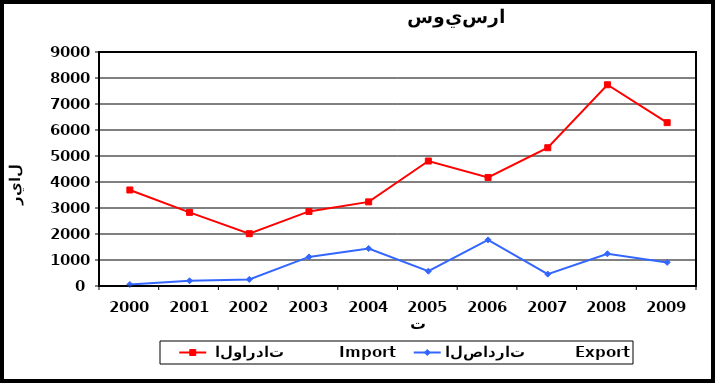
| Category |  الواردات           Import | الصادرات          Export |
|---|---|---|
| 2000.0 | 3693 | 58 |
| 2001.0 | 2832 | 201 |
| 2002.0 | 2012 | 252 |
| 2003.0 | 2868 | 1119 |
| 2004.0 | 3236 | 1442 |
| 2005.0 | 4807 | 570 |
| 2006.0 | 4176 | 1774 |
| 2007.0 | 5318 | 457 |
| 2008.0 | 7740 | 1239 |
| 2009.0 | 6283 | 908 |